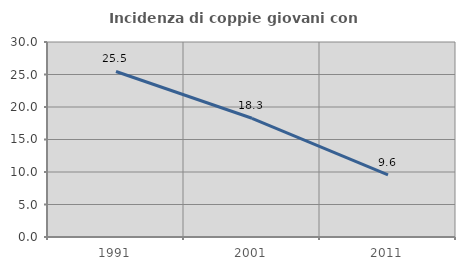
| Category | Incidenza di coppie giovani con figli |
|---|---|
| 1991.0 | 25.464 |
| 2001.0 | 18.264 |
| 2011.0 | 9.573 |